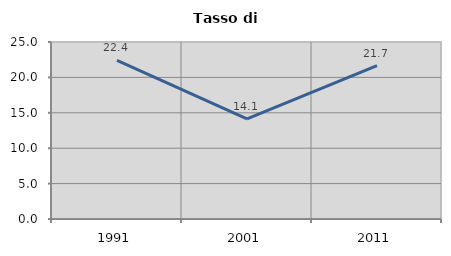
| Category | Tasso di disoccupazione   |
|---|---|
| 1991.0 | 22.414 |
| 2001.0 | 14.141 |
| 2011.0 | 21.667 |